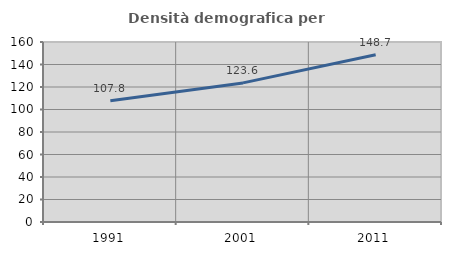
| Category | Densità demografica |
|---|---|
| 1991.0 | 107.839 |
| 2001.0 | 123.646 |
| 2011.0 | 148.688 |